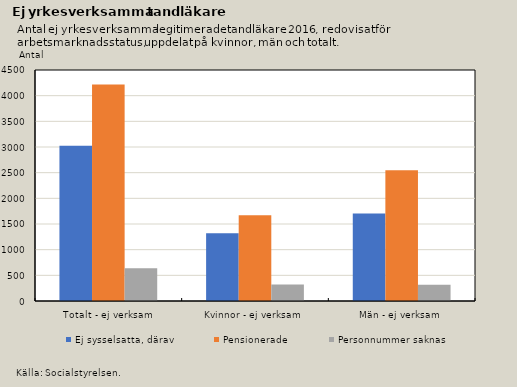
| Category | Ej sysselsatta, därav | Pensionerade | Personnummer saknas |
|---|---|---|---|
| Totalt - ej verksam | 3024 | 4217 | 638 |
| Kvinnor - ej verksam | 1319 | 1671 | 321 |
| Män - ej verksam | 1705 | 2546 | 317 |